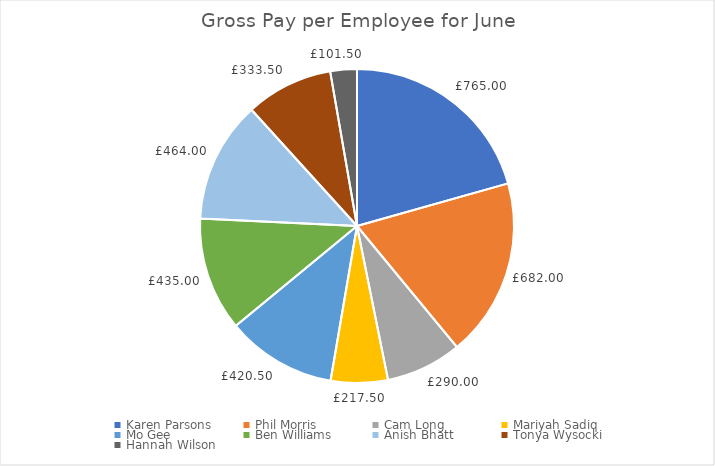
| Category |  Gross Pay  |
|---|---|
| Karen Parsons | 765 |
| Phil Morris | 682 |
| Cam Long | 290 |
| Mariyah Sadiq | 217.5 |
| Mo Gee | 420.5 |
| Ben Williams | 435 |
| Anish Bhatt | 464 |
| Tonya Wysocki | 333.5 |
| Hannah Wilson | 101.5 |